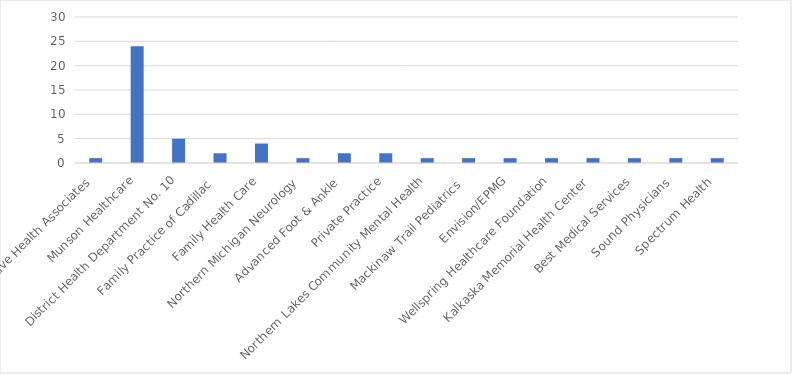
| Category | Number of Responses |
|---|---|
| Digestive Health Associates | 1 |
| Munson Healthcare | 24 |
| District Health Department No. 10 | 5 |
| Family Practice of Cadillac  | 2 |
| Family Health Care | 4 |
| Northern Michigan Neurology  | 1 |
| Advanced Foot & Ankle  | 2 |
| Private Practice | 2 |
| Northern Lakes Community Mental Health | 1 |
| Mackinaw Trail Pediatrics  | 1 |
| Envision/EPMG | 1 |
| Wellspring Healthcare Foundation | 1 |
| Kalkaska Memorial Health Center | 1 |
| Best Medical Services | 1 |
| Sound Physicians  | 1 |
| Spectrum Health  | 1 |